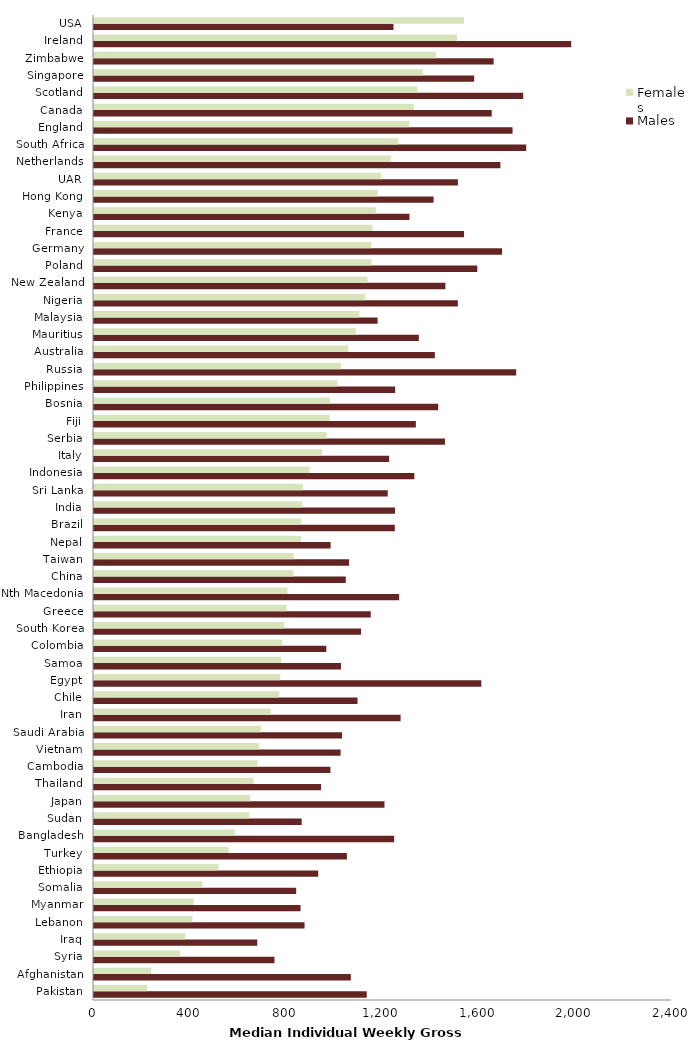
| Category | Males | Females |
|---|---|---|
| Pakistan | 1132.429 | 220.572 |
| Afghanistan | 1066.395 | 237.482 |
| Syria | 749.265 | 358.101 |
| Iraq | 677.863 | 379.119 |
| Lebanon | 874.324 | 408.876 |
| Myanmar | 857.685 | 414.135 |
| Somalia | 839.535 | 450.424 |
| Ethiopia | 931.102 | 517.523 |
| Turkey | 1050.132 | 559.643 |
| Bangladesh | 1246.316 | 586.19 |
| Sudan | 862.209 | 645.28 |
| Japan | 1206.157 | 647.735 |
| Thailand | 942.708 | 662.277 |
| Cambodia | 981.624 | 679.749 |
| Vietnam | 1024.063 | 685.976 |
| Saudi Arabia | 1030.134 | 692.626 |
| Iran | 1273.164 | 734.549 |
| Chile | 1094.109 | 768.786 |
| Egypt | 1608.129 | 773.37 |
| Samoa | 1025.51 | 777.099 |
| Colombia | 964.674 | 781.498 |
| South Korea | 1108.877 | 790.709 |
| Greece | 1149.089 | 798.739 |
| Nth Macedonia | 1267.123 | 802.956 |
| China | 1045.449 | 828.044 |
| Taiwan | 1059.069 | 829.254 |
| Nepal | 982.399 | 859.86 |
| Brazil | 1249.084 | 860.3 |
| India | 1249.852 | 864.602 |
| Sri Lanka | 1219.636 | 867.56 |
| Indonesia | 1330.184 | 895.122 |
| Italy | 1225.579 | 946.792 |
| Serbia | 1457.176 | 965.766 |
| Fiji | 1336.372 | 978.763 |
| Bosnia | 1429.209 | 979.141 |
| Philippines | 1250.519 | 1010.681 |
| Russia | 1753.012 | 1025.371 |
| Australia | 1415.171 | 1055.096 |
| Mauritius | 1348.856 | 1087.313 |
| Malaysia | 1177.483 | 1101.645 |
| Nigeria | 1510.776 | 1126.168 |
| New Zealand | 1458.993 | 1135.741 |
| Poland | 1591.535 | 1151.659 |
| Germany | 1694.378 | 1151.724 |
| France | 1536.538 | 1155.968 |
| Kenya | 1309.949 | 1170.513 |
| Hong Kong | 1409.93 | 1178.515 |
| UAR | 1510.922 | 1191.667 |
| Netherlands | 1687.5 | 1232.292 |
| South Africa | 1794.681 | 1263.514 |
| England | 1737.983 | 1309.647 |
| Canada | 1651.57 | 1327.663 |
| Scotland | 1782.189 | 1343.625 |
| Singapore | 1578.547 | 1364.428 |
| Zimbabwe | 1659.392 | 1421.224 |
| Ireland | 1981.667 | 1507.236 |
| USA | 1243.64 | 1536.602 |